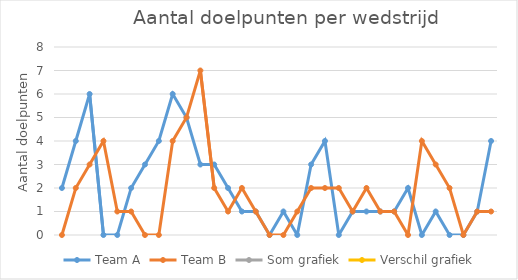
| Category | Team A | Team B | Som grafiek | Verschil grafiek |
|---|---|---|---|---|
| 0 | 2 | 0 |  |  |
| 1 | 4 | 2 |  |  |
| 2 | 6 | 3 |  |  |
| 3 | 0 | 4 |  |  |
| 4 | 0 | 1 |  |  |
| 5 | 2 | 1 |  |  |
| 6 | 3 | 0 |  |  |
| 7 | 4 | 0 |  |  |
| 8 | 6 | 4 |  |  |
| 9 | 5 | 5 |  |  |
| 10 | 3 | 7 |  |  |
| 11 | 3 | 2 |  |  |
| 12 | 2 | 1 |  |  |
| 13 | 1 | 2 |  |  |
| 14 | 1 | 1 |  |  |
| 15 | 0 | 0 |  |  |
| 16 | 1 | 0 |  |  |
| 17 | 0 | 1 |  |  |
| 18 | 3 | 2 |  |  |
| 19 | 4 | 2 |  |  |
| 20 | 0 | 2 |  |  |
| 21 | 1 | 1 |  |  |
| 22 | 1 | 2 |  |  |
| 23 | 1 | 1 |  |  |
| 24 | 1 | 1 |  |  |
| 25 | 2 | 0 |  |  |
| 26 | 0 | 4 |  |  |
| 27 | 1 | 3 |  |  |
| 28 | 0 | 2 |  |  |
| 29 | 0 | 0 |  |  |
| 30 | 1 | 1 |  |  |
| 31 | 4 | 1 |  |  |